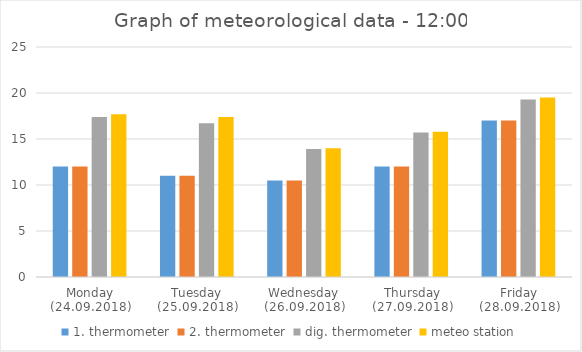
| Category | 1. thermometer | 2. thermometer | dig. thermometer | meteo station |
|---|---|---|---|---|
| Monday (24.09.2018) | 12 | 12 | 17.4 | 17.7 |
| Tuesday (25.09.2018) | 11 | 11 | 16.7 | 17.4 |
| Wednesday (26.09.2018) | 10.5 | 10.5 | 13.9 | 14 |
| Thursday (27.09.2018) | 12 | 12 | 15.7 | 15.8 |
| Friday (28.09.2018) | 17 | 17 | 19.3 | 19.5 |